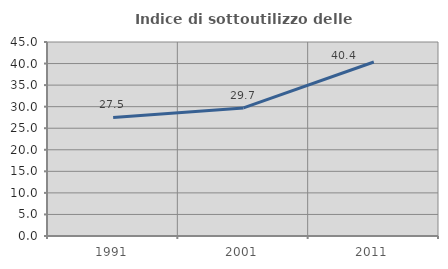
| Category | Indice di sottoutilizzo delle abitazioni  |
|---|---|
| 1991.0 | 27.495 |
| 2001.0 | 29.714 |
| 2011.0 | 40.358 |